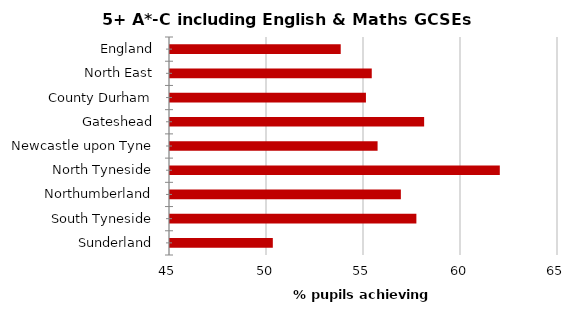
| Category | Series 0 |
|---|---|
| England | 53.8 |
| North East | 55.4 |
| County Durham | 55.1 |
| Gateshead | 58.1 |
| Newcastle upon Tyne | 55.7 |
| North Tyneside | 62 |
| Northumberland | 56.9 |
| South Tyneside | 57.7 |
| Sunderland | 50.3 |